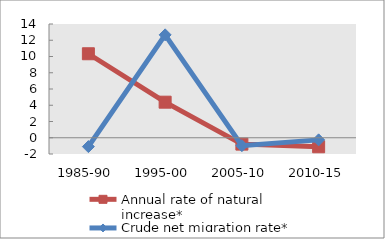
| Category | Annual rate of natural increase* | Crude net migration rate* |
|---|---|---|
| 1985-90 | 10.338 | -1.091 |
| 1995-00 | 4.378 | 12.664 |
| 2005-10 | -0.783 | -0.973 |
| 2010-15 | -1.109 | -0.261 |